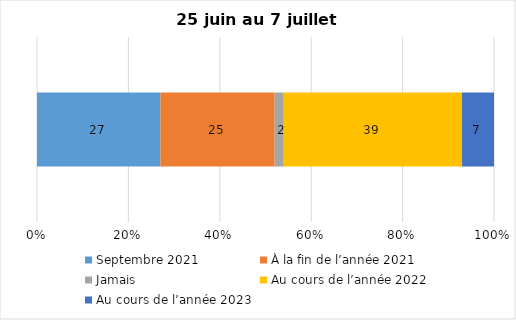
| Category | Septembre 2021 | À la fin de l’année 2021 | Jamais | Au cours de l’année 2022 | Au cours de l’année 2023 |
|---|---|---|---|---|---|
| 0 | 27 | 25 | 2 | 39 | 7 |